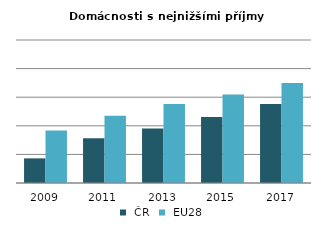
| Category |  ČR |  EU28 |
|---|---|---|
| 2009.0 | 0.172 | 0.368 |
| 2011.0 | 0.313 | 0.471 |
| 2013.0 | 0.381 | 0.552 |
| 2015.0 | 0.461 | 0.618 |
| 2017.0 | 0.552 | 0.7 |